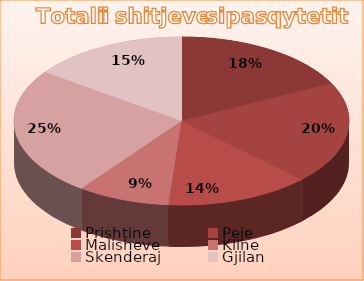
| Category | Series 0 |
|---|---|
| Prishtine | 5021 |
| Peje | 5632 |
| Malisheve | 3985 |
| Kline | 2546 |
| Skenderaj | 7050 |
| Gjilan | 4325 |